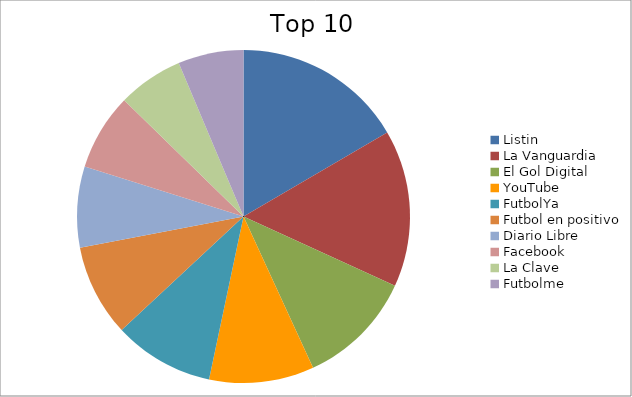
| Category | Series 0 |
|---|---|
| Listin | 4.64 |
| La Vanguardia | 4.27 |
| El Gol Digital | 3.17 |
| YouTube | 2.85 |
| FutbolYa | 2.73 |
| Futbol en positivo | 2.5 |
| Diario Libre | 2.2 |
| Facebook | 2.08 |
| La Clave | 1.78 |
| Futbolme | 1.78 |